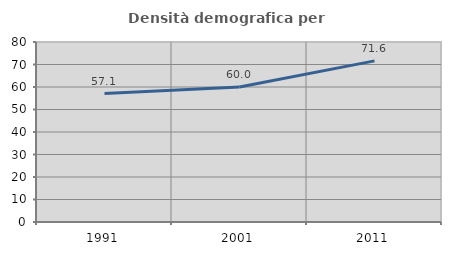
| Category | Densità demografica |
|---|---|
| 1991.0 | 57.107 |
| 2001.0 | 59.96 |
| 2011.0 | 71.622 |